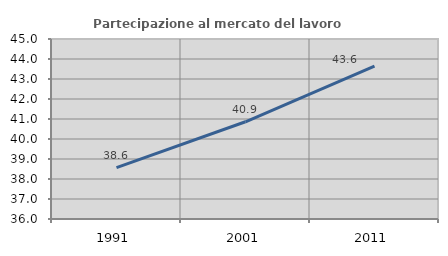
| Category | Partecipazione al mercato del lavoro  femminile |
|---|---|
| 1991.0 | 38.567 |
| 2001.0 | 40.862 |
| 2011.0 | 43.646 |